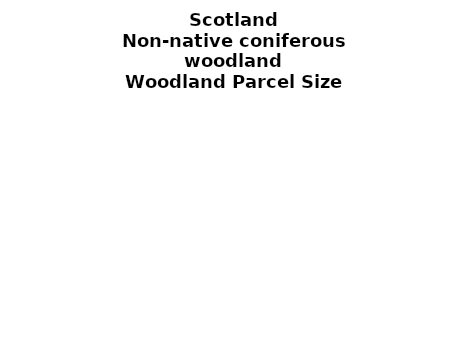
| Category | Non-native coniferous woodland |
|---|---|
| <5 ha | 0.027 |
| ≥5 and <10 ha | 0.015 |
| ≥10 and <15 ha | 0.013 |
| ≥15 and <20 ha | 0.013 |
| ≥20 and <25 ha | 0.012 |
| ≥25 and <30 ha | 0.01 |
| ≥30 and <35 ha | 0.009 |
| ≥35 and <40 ha | 0.007 |
| ≥40 and <45 ha | 0.005 |
| ≥45 and <50 ha | 0.006 |
| ≥50 and <60 ha | 0.012 |
| ≥60 and <70 ha | 0.014 |
| ≥70 and <80 ha | 0.012 |
| ≥80 and <90 ha | 0.009 |
| ≥90 and <100 ha | 0.011 |
| ≥100 and <150 ha | 0.034 |
| ≥150 and <200 ha | 0.03 |
| ≥200 ha | 0.764 |